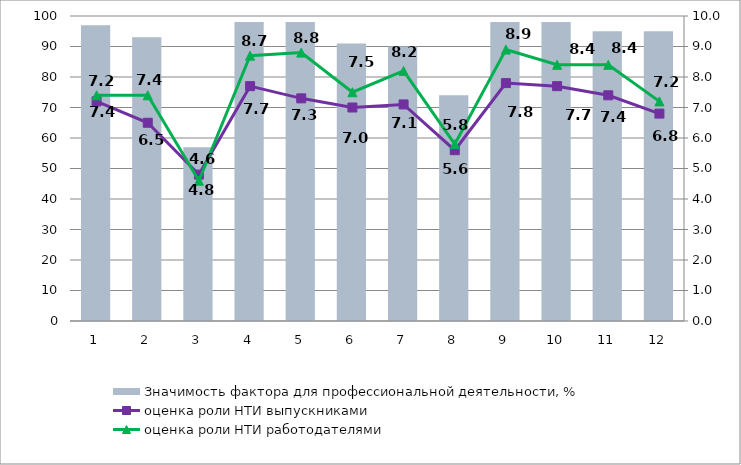
| Category | Значимость фактора для профессиональной деятельности, % |
|---|---|
| 1.0 | 97 |
| 2.0 | 93 |
| 3.0 | 57 |
| 4.0 | 98 |
| 5.0 | 98 |
| 6.0 | 91 |
| 7.0 | 90 |
| 8.0 | 74 |
| 9.0 | 98 |
| 10.0 | 98 |
| 11.0 | 95 |
| 12.0 | 95 |